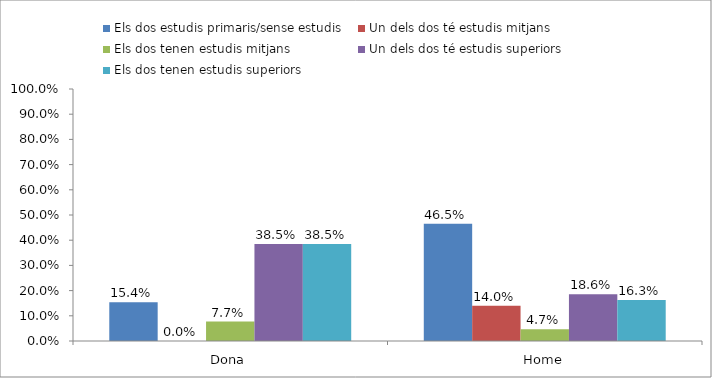
| Category | Els dos estudis primaris/sense estudis | Un dels dos té estudis mitjans | Els dos tenen estudis mitjans | Un dels dos té estudis superiors | Els dos tenen estudis superiors |
|---|---|---|---|---|---|
| Dona | 0.154 | 0 | 0.077 | 0.385 | 0.385 |
| Home | 0.465 | 0.14 | 0.046 | 0.186 | 0.163 |